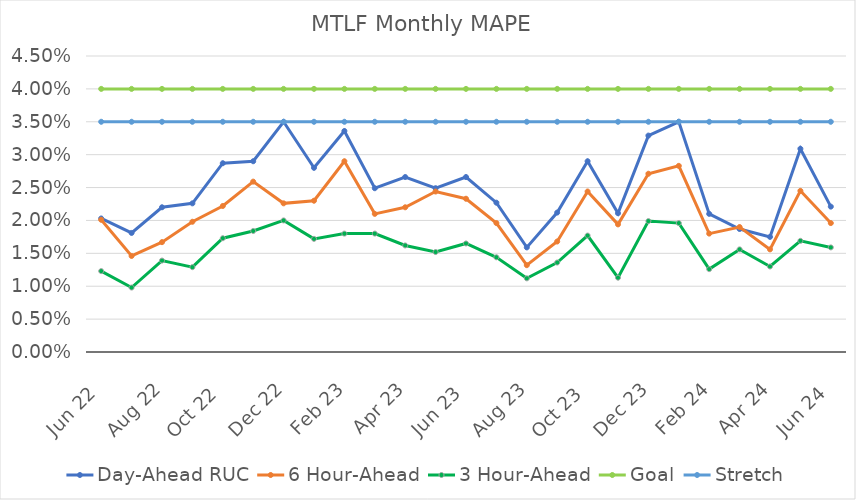
| Category | Day-Ahead RUC | 6 Hour-Ahead | 3 Hour-Ahead | Goal | Stretch |
|---|---|---|---|---|---|
| 2022-06-20 | 0.02 | 0.02 | 0.012 | 0.04 | 0.035 |
| 2022-07-20 | 0.018 | 0.015 | 0.01 | 0.04 | 0.035 |
| 2022-08-20 | 0.022 | 0.017 | 0.014 | 0.04 | 0.035 |
| 2022-09-20 | 0.023 | 0.02 | 0.013 | 0.04 | 0.035 |
| 2022-10-20 | 0.029 | 0.022 | 0.017 | 0.04 | 0.035 |
| 2022-11-20 | 0.029 | 0.026 | 0.018 | 0.04 | 0.035 |
| 2022-12-20 | 0.035 | 0.023 | 0.02 | 0.04 | 0.035 |
| 2023-01-20 | 0.028 | 0.023 | 0.017 | 0.04 | 0.035 |
| 2023-02-20 | 0.034 | 0.029 | 0.018 | 0.04 | 0.035 |
| 2023-03-20 | 0.025 | 0.021 | 0.018 | 0.04 | 0.035 |
| 2023-04-20 | 0.027 | 0.022 | 0.016 | 0.04 | 0.035 |
| 2023-05-20 | 0.025 | 0.024 | 0.015 | 0.04 | 0.035 |
| 2023-06-20 | 0.027 | 0.023 | 0.016 | 0.04 | 0.035 |
| 2023-07-20 | 0.023 | 0.02 | 0.014 | 0.04 | 0.035 |
| 2023-08-20 | 0.016 | 0.013 | 0.011 | 0.04 | 0.035 |
| 2023-09-20 | 0.021 | 0.017 | 0.014 | 0.04 | 0.035 |
| 2023-10-20 | 0.029 | 0.024 | 0.018 | 0.04 | 0.035 |
| 2023-11-20 | 0.021 | 0.019 | 0.011 | 0.04 | 0.035 |
| 2023-12-20 | 0.033 | 0.027 | 0.02 | 0.04 | 0.035 |
| 2024-01-20 | 0.035 | 0.028 | 0.02 | 0.04 | 0.035 |
| 2024-02-20 | 0.021 | 0.018 | 0.013 | 0.04 | 0.035 |
| 2024-03-20 | 0.019 | 0.019 | 0.016 | 0.04 | 0.035 |
| 2024-04-20 | 0.018 | 0.016 | 0.013 | 0.04 | 0.035 |
| 2024-05-24 | 0.031 | 0.024 | 0.017 | 0.04 | 0.035 |
| 2024-06-24 | 0.022 | 0.02 | 0.016 | 0.04 | 0.035 |